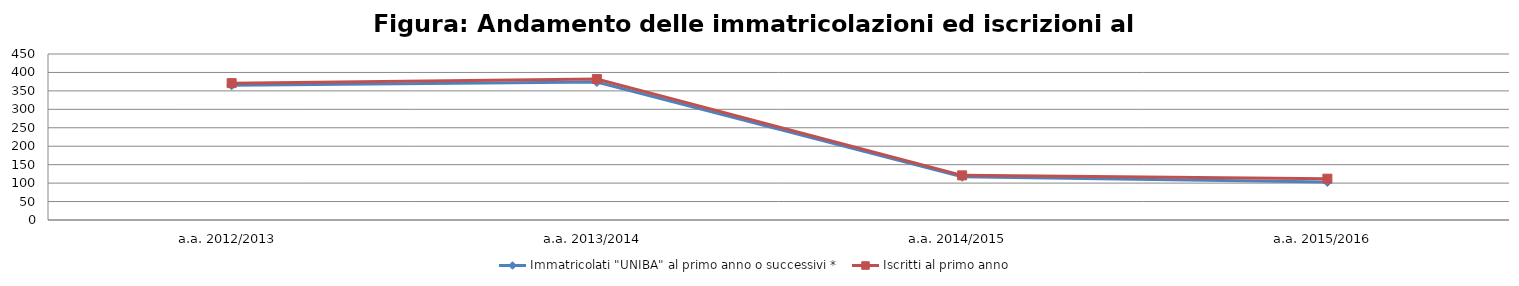
| Category | Immatricolati "UNIBA" al primo anno o successivi * | Iscritti al primo anno  |
|---|---|---|
| a.a. 2012/2013 | 365 | 371 |
| a.a. 2013/2014 | 374 | 382 |
| a.a. 2014/2015 | 117 | 121 |
| a.a. 2015/2016 | 103 | 112 |